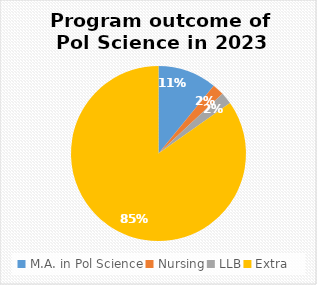
| Category | Series 0 |
|---|---|
| M.A. in Pol Science | 5 |
| Nursing | 1 |
| LLB | 1 |
| Extra | 39 |